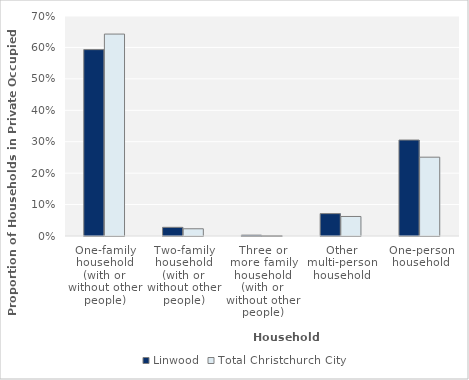
| Category | Linwood | Total Christchurch City |
|---|---|---|
| One-family household (with or without other people) | 0.593 |  |
| Two-family household (with or without other people) | 0.028 |  |
| Three or more family household (with or without other people) | 0.003 |  |
| Other multi-person household | 0.071 |  |
| One-person household | 0.305 |  |